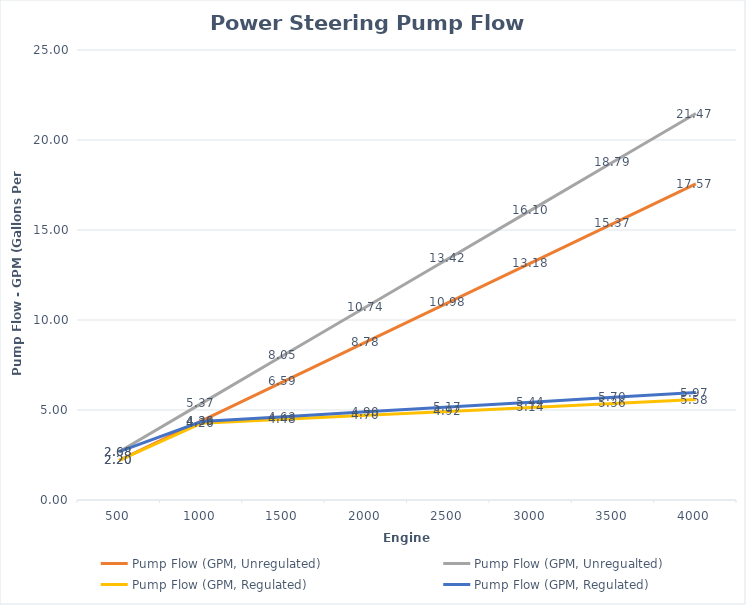
| Category | Pump Flow (GPM, Unregulated) | Pump Flow (GPM, Unregualted) | Pump Flow (GPM, Regulated) |
|---|---|---|---|
| 500.0 | 2.196 | 2.684 | 2.684 |
| 1000.0 | 4.392 | 5.368 | 4.362 |
| 1500.0 | 6.588 | 8.052 | 4.63 |
| 2000.0 | 8.784 | 10.736 | 4.899 |
| 2500.0 | 10.98 | 13.42 | 5.167 |
| 3000.0 | 13.176 | 16.104 | 5.435 |
| 3500.0 | 15.372 | 18.788 | 5.704 |
| 4000.0 | 17.568 | 21.472 | 5.972 |